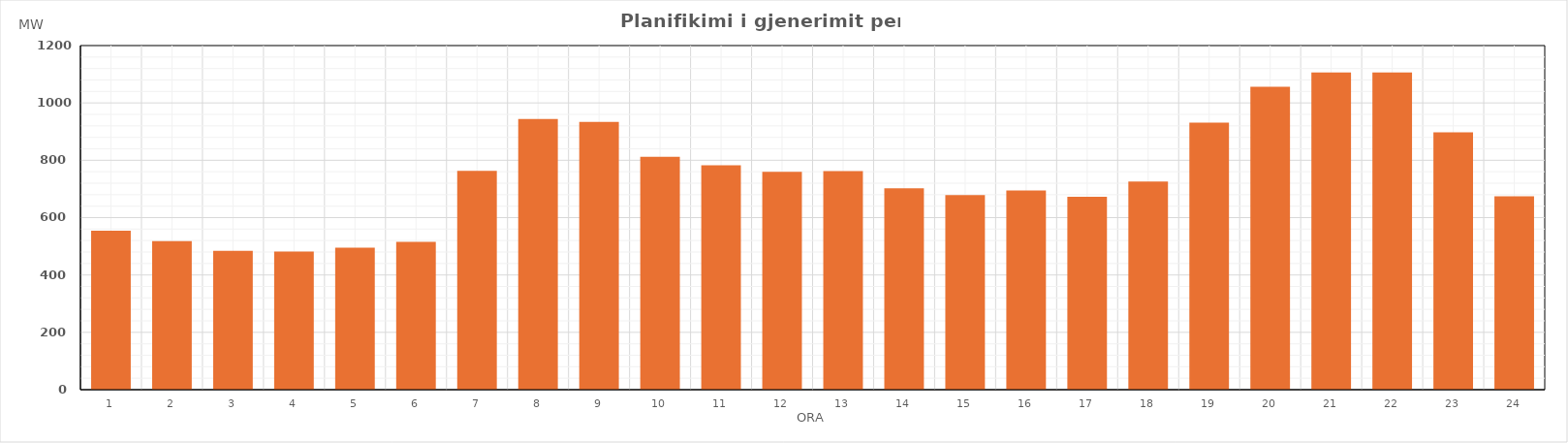
| Category | Max (MW) |
|---|---|
| 0 | 554.61 |
| 1 | 517.68 |
| 2 | 484 |
| 3 | 481.71 |
| 4 | 495.13 |
| 5 | 515.81 |
| 6 | 763.38 |
| 7 | 943.8 |
| 8 | 934.02 |
| 9 | 812.24 |
| 10 | 782.61 |
| 11 | 759.61 |
| 12 | 762.45 |
| 13 | 701.91 |
| 14 | 678.74 |
| 15 | 694.62 |
| 16 | 672.98 |
| 17 | 726.27 |
| 18 | 930.96 |
| 19 | 1056.18 |
| 20 | 1106.12 |
| 21 | 1106.49 |
| 22 | 897.07 |
| 23 | 674.21 |